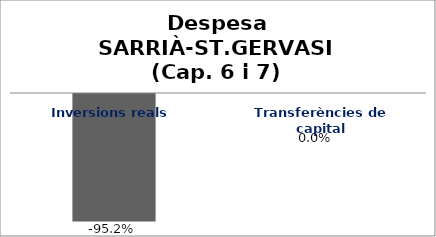
| Category | Series 0 |
|---|---|
| Inversions reals | -0.952 |
| Transferències de capital | 0 |